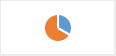
| Category | Section 2.B : Communication institutionnelle, communication grand public et mobilisation sociale |
|---|---|
| 0 | 0.333 |
| 1 | 0.667 |